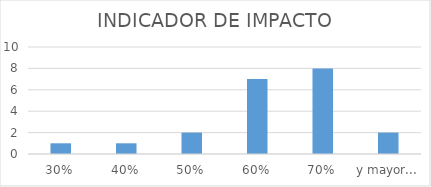
| Category | Frecuencia |
|---|---|
| 30% | 1 |
| 40% | 1 |
| 50% | 2 |
| 60% | 7 |
| 70% | 8 |
| y mayor... | 2 |